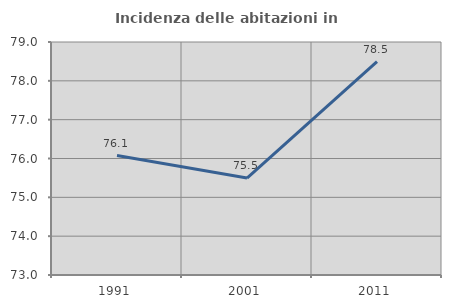
| Category | Incidenza delle abitazioni in proprietà  |
|---|---|
| 1991.0 | 76.077 |
| 2001.0 | 75.498 |
| 2011.0 | 78.495 |